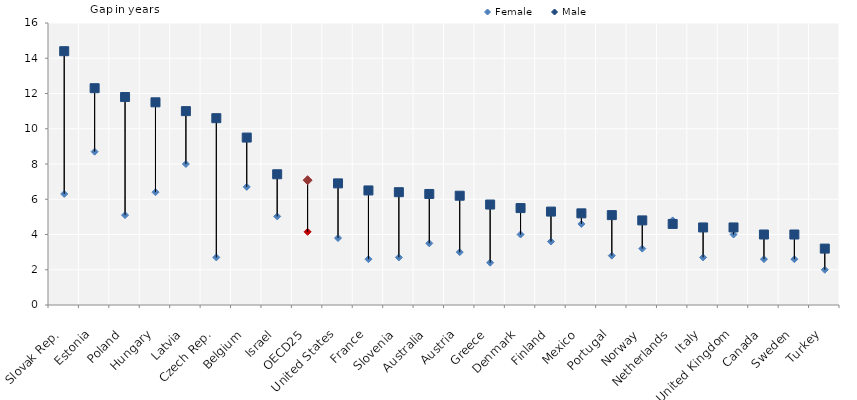
| Category | Female | Male |
|---|---|---|
| Slovak Rep. | 6.3 | 14.4 |
| Estonia | 8.7 | 12.3 |
| Poland | 5.1 | 11.8 |
| Hungary | 6.4 | 11.5 |
| Latvia | 8 | 11 |
| Czech Rep. | 2.7 | 10.6 |
| Belgium | 6.7 | 9.5 |
| Israel | 5.026 | 7.418 |
| OECD25 | 4.153 | 7.081 |
| United States | 3.8 | 6.9 |
| France | 2.6 | 6.5 |
| Slovenia | 2.7 | 6.4 |
| Australia | 3.5 | 6.3 |
| Austria | 3 | 6.2 |
| Greece | 2.4 | 5.7 |
| Denmark | 4 | 5.5 |
| Finland | 3.6 | 5.3 |
| Mexico | 4.6 | 5.2 |
| Portugal | 2.8 | 5.1 |
| Norway | 3.2 | 4.8 |
| Netherlands | 4.8 | 4.6 |
| Italy | 2.7 | 4.4 |
| United Kingdom | 4 | 4.4 |
| Canada | 2.6 | 4 |
| Sweden | 2.6 | 4 |
| Turkey | 2 | 3.2 |